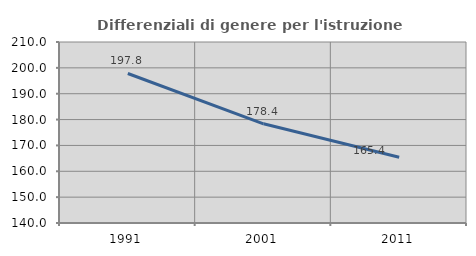
| Category | Differenziali di genere per l'istruzione superiore |
|---|---|
| 1991.0 | 197.826 |
| 2001.0 | 178.356 |
| 2011.0 | 165.412 |